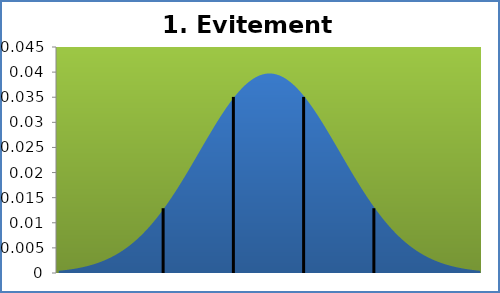
| Category | densité |
|---|---|
| 5.050000000000004 | 0 |
| 5.552000000000007 | 0.001 |
| 6.054000000000006 | 0.001 |
| 6.5560000000000045 | 0.001 |
| 7.058 | 0.001 |
| 7.560000000000006 | 0.001 |
| 8.062000000000005 | 0.001 |
| 8.564 | 0.001 |
| 9.066000000000006 | 0.001 |
| 9.568000000000005 | 0.002 |
| 10.070000000000004 | 0.002 |
| 10.572000000000003 | 0.002 |
| 11.074000000000005 | 0.002 |
| 11.576000000000004 | 0.003 |
| 12.078000000000003 | 0.003 |
| 12.580000000000005 | 0.003 |
| 13.082 | 0.004 |
| 13.584000000000003 | 0.004 |
| 14.086000000000006 | 0.004 |
| 14.588000000000001 | 0.005 |
| 15.090000000000003 | 0.005 |
| 15.592000000000006 | 0.006 |
| 16.094 | 0.007 |
| 16.596000000000004 | 0.007 |
| 17.098000000000006 | 0.008 |
| 17.6 | 0.009 |
| 18.102000000000004 | 0.009 |
| 18.604000000000003 | 0.01 |
| 19.106 | 0.011 |
| 19.608000000000004 | 0.012 |
| 20.110000000000003 | 0.013 |
| 20.612000000000002 | 0.014 |
| 21.114 | 0.015 |
| 21.616000000000003 | 0.016 |
| 22.118000000000002 | 0.017 |
| 22.620000000000005 | 0.018 |
| 23.122000000000003 | 0.019 |
| 23.624000000000002 | 0.021 |
| 24.126 | 0.022 |
| 24.628000000000004 | 0.023 |
| 25.130000000000003 | 0.024 |
| 25.632 | 0.025 |
| 26.134000000000004 | 0.027 |
| 26.636000000000003 | 0.028 |
| 27.138 | 0.029 |
| 27.64 | 0.03 |
| 28.142000000000003 | 0.031 |
| 28.644000000000002 | 0.032 |
| 29.146 | 0.033 |
| 29.648000000000003 | 0.034 |
| 30.150000000000002 | 0.035 |
| 30.652 | 0.036 |
| 31.154000000000003 | 0.037 |
| 31.656000000000002 | 0.037 |
| 32.158 | 0.038 |
| 32.660000000000004 | 0.039 |
| 33.162 | 0.039 |
| 33.664 | 0.039 |
| 34.166000000000004 | 0.04 |
| 34.668 | 0.04 |
| 35.17 | 0.04 |
| 35.672000000000004 | 0.04 |
| 36.174 | 0.04 |
| 36.676 | 0.039 |
| 37.178000000000004 | 0.039 |
| 37.68 | 0.039 |
| 38.182 | 0.038 |
| 38.684000000000005 | 0.037 |
| 39.186 | 0.037 |
| 39.688 | 0.036 |
| 40.19 | 0.035 |
| 40.692 | 0.034 |
| 41.194 | 0.033 |
| 41.696 | 0.032 |
| 42.198 | 0.031 |
| 42.7 | 0.03 |
| 43.202 | 0.029 |
| 43.704 | 0.028 |
| 44.206 | 0.027 |
| 44.708 | 0.025 |
| 45.21 | 0.024 |
| 45.712 | 0.023 |
| 46.214 | 0.022 |
| 46.716 | 0.021 |
| 47.218 | 0.019 |
| 47.72 | 0.018 |
| 48.222 | 0.017 |
| 48.724000000000004 | 0.016 |
| 49.226 | 0.015 |
| 49.728 | 0.014 |
| 50.230000000000004 | 0.013 |
| 50.732 | 0.012 |
| 51.234 | 0.011 |
| 51.736000000000004 | 0.01 |
| 52.238 | 0.009 |
| 52.74 | 0.009 |
| 53.242 | 0.008 |
| 53.744 | 0.007 |
| 54.246 | 0.007 |
| 54.748 | 0.006 |
| 55.25 | 0.005 |
| 55.752 | 0.005 |
| 56.254 | 0.004 |
| 56.756 | 0.004 |
| 57.258 | 0.004 |
| 57.76 | 0.003 |
| 58.262 | 0.003 |
| 58.763999999999996 | 0.003 |
| 59.266 | 0.002 |
| 59.768 | 0.002 |
| 60.269999999999996 | 0.002 |
| 60.772 | 0.002 |
| 61.274 | 0.001 |
| 61.776 | 0.001 |
| 62.278 | 0.001 |
| 62.78 | 0.001 |
| 63.282000000000004 | 0.001 |
| 63.784 | 0.001 |
| 64.286 | 0.001 |
| 64.788 | 0.001 |
| 65.28999999999999 | 0 |